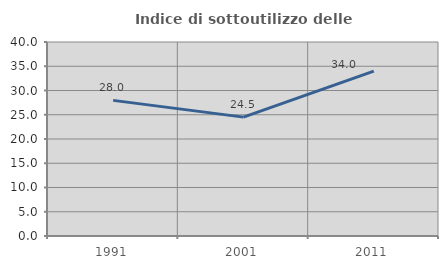
| Category | Indice di sottoutilizzo delle abitazioni  |
|---|---|
| 1991.0 | 27.966 |
| 2001.0 | 24.51 |
| 2011.0 | 33.981 |